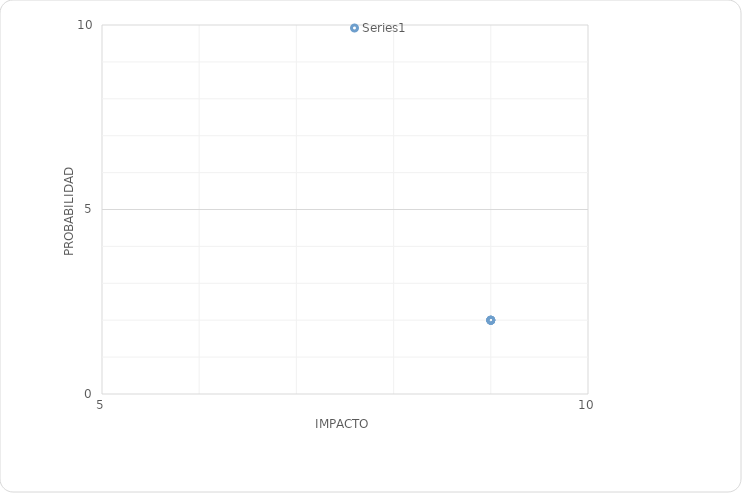
| Category | Series 0 |
|---|---|
| 9.0 | 2 |
| 9.0 | 2 |
| 9.0 | 2 |
| 9.0 | 2 |